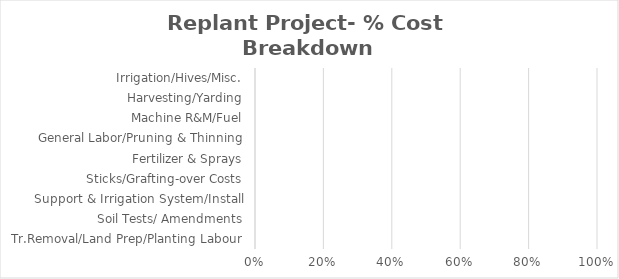
| Category | Series 3 |
|---|---|
| Tr.Removal/Land Prep/Planting Labour | 0 |
| Soil Tests/ Amendments | 0 |
| Support & Irrigation System/Install | 0 |
| Sticks/Grafting-over Costs | 0 |
| Fertilizer & Sprays | 0 |
| General Labor/Pruning & Thinning | 0 |
| Machine R&M/Fuel | 0 |
| Harvesting/Yarding | 0 |
| Irrigation/Hives/Misc. | 0 |